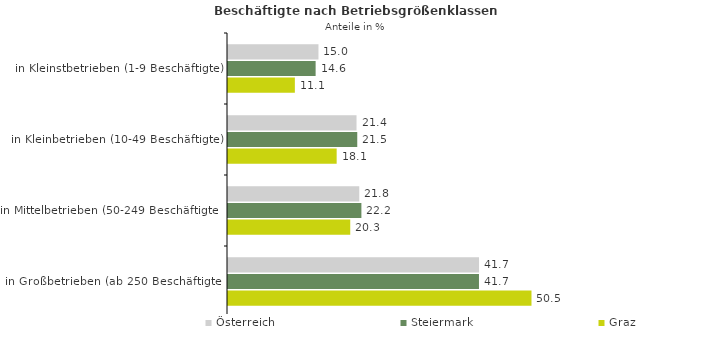
| Category | Österreich | Steiermark | Graz |
|---|---|---|---|
| in Kleinstbetrieben (1-9 Beschäftigte) | 15.046 | 14.574 | 11.12 |
| in Kleinbetrieben (10-49 Beschäftigte) | 21.375 | 21.498 | 18.073 |
| in Mittelbetrieben (50-249 Beschäftigte) | 21.831 | 22.187 | 20.331 |
| in Großbetrieben (ab 250 Beschäftigte) | 41.748 | 41.742 | 50.476 |